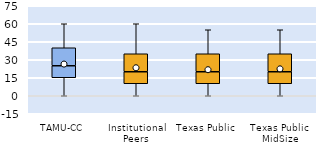
| Category | 25th | 50th | 75th |
|---|---|---|---|
| TAMU-CC | 15 | 10 | 15 |
| Institutional Peers | 10 | 10 | 15 |
| Texas Public | 10 | 10 | 15 |
| Texas Public MidSize | 10 | 10 | 15 |